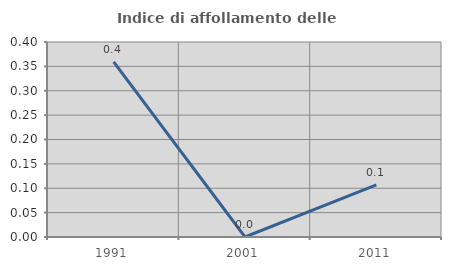
| Category | Indice di affollamento delle abitazioni  |
|---|---|
| 1991.0 | 0.359 |
| 2001.0 | 0 |
| 2011.0 | 0.107 |